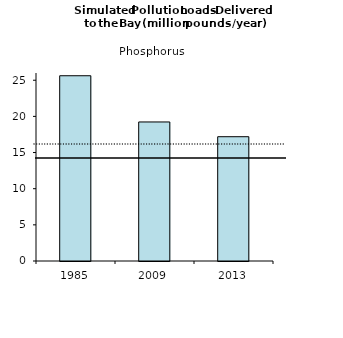
| Category | Series 0 |
|---|---|
| 1985.0 | 25.621 |
| 2009.0 | 19.229 |
| 2013.0 | 17.189 |